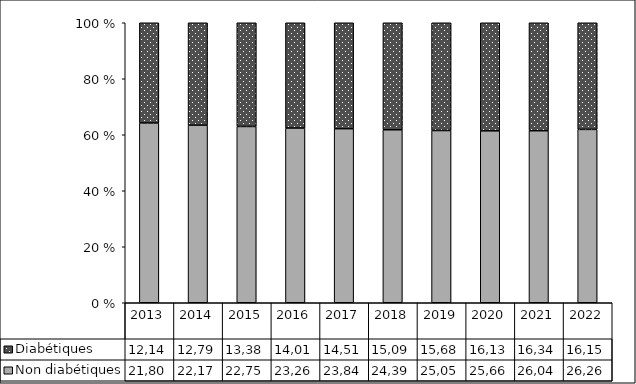
| Category | Non diabétiques | Diabétiques |
|---|---|---|
| 2013 | 21804 | 12149 |
| 2014 | 22171 | 12794 |
| 2015 | 22751 | 13384 |
| 2016 | 23260 | 14016 |
| 2017 | 23847 | 14513 |
| 2018 | 24399 | 15094 |
| 2019 | 25058 | 15680 |
| 2020 | 25664 | 16131 |
| 2021 | 26043 | 16346 |
| 2022 | 26260 | 16151 |